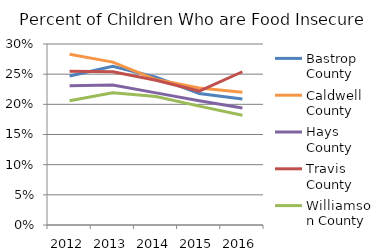
| Category | Bastrop County | Caldwell County | Hays County | Travis County | Williamson County |
|---|---|---|---|---|---|
| 2012.0 | 0.247 | 0.283 | 0.231 | 0.255 | 0.206 |
| 2013.0 | 0.263 | 0.27 | 0.232 | 0.254 | 0.219 |
| 2014.0 | 0.245 | 0.241 | 0.219 | 0.24 | 0.213 |
| 2015.0 | 0.218 | 0.227 | 0.206 | 0.222 | 0.197 |
| 2016.0 | 0.209 | 0.22 | 0.194 | 0.254 | 0.182 |